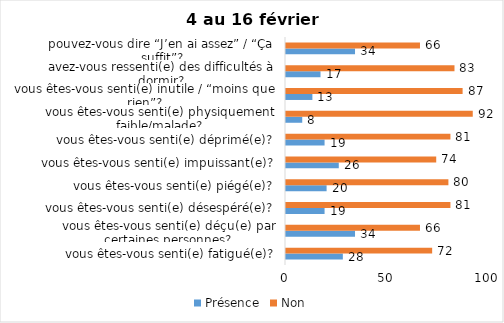
| Category | Présence | Non |
|---|---|---|
| vous êtes-vous senti(e) fatigué(e)? | 28 | 72 |
| vous êtes-vous senti(e) déçu(e) par certaines personnes? | 34 | 66 |
| vous êtes-vous senti(e) désespéré(e)? | 19 | 81 |
| vous êtes-vous senti(e) piégé(e)? | 20 | 80 |
| vous êtes-vous senti(e) impuissant(e)? | 26 | 74 |
| vous êtes-vous senti(e) déprimé(e)? | 19 | 81 |
| vous êtes-vous senti(e) physiquement faible/malade? | 8 | 92 |
| vous êtes-vous senti(e) inutile / “moins que rien”? | 13 | 87 |
| avez-vous ressenti(e) des difficultés à dormir? | 17 | 83 |
| pouvez-vous dire “J’en ai assez” / “Ça suffit”? | 34 | 66 |